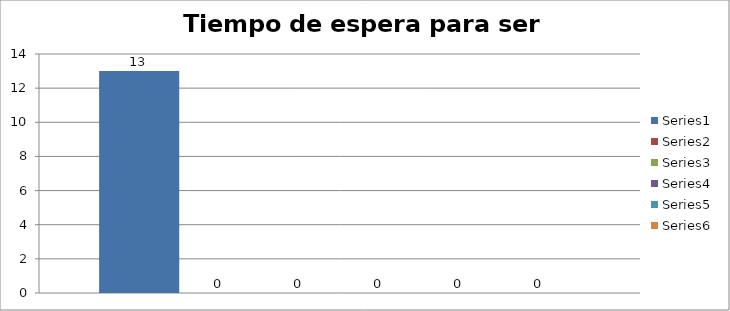
| Category | Series 0 | Series 1 | Series 2 | Series 3 | Series 4 | Series 5 |
|---|---|---|---|---|---|---|
| 0 | 13 | 0 | 0 | 0 | 0 | 0 |